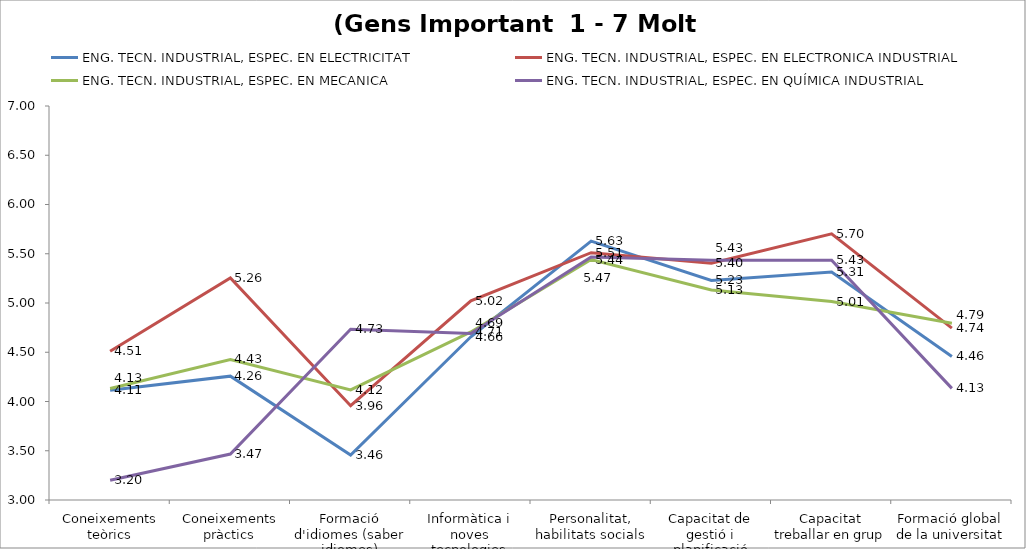
| Category | ENG. TECN. INDUSTRIAL, ESPEC. EN ELECTRICITAT | ENG. TECN. INDUSTRIAL, ESPEC. EN ELECTRONICA INDUSTRIAL | ENG. TECN. INDUSTRIAL, ESPEC. EN MECANICA | ENG. TECN. INDUSTRIAL, ESPEC. EN QUÍMICA INDUSTRIAL |
|---|---|---|---|---|
| Coneixements teòrics | 4.114 | 4.511 | 4.132 | 3.2 |
| Coneixements pràctics | 4.257 | 5.255 | 4.426 | 3.467 |
| Formació d'idiomes (saber idiomes) | 3.457 | 3.957 | 4.118 | 4.733 |
| Informàtica i noves tecnologies | 4.657 | 5.021 | 4.706 | 4.69 |
| Personalitat, habilitats socials | 5.629 | 5.511 | 5.441 | 5.467 |
| Capacitat de gestió i planificació | 5.229 | 5.404 | 5.132 | 5.433 |
| Capacitat treballar en grup | 5.314 | 5.702 | 5.015 | 5.433 |
| Formació global de la universitat | 4.457 | 4.745 | 4.794 | 4.133 |